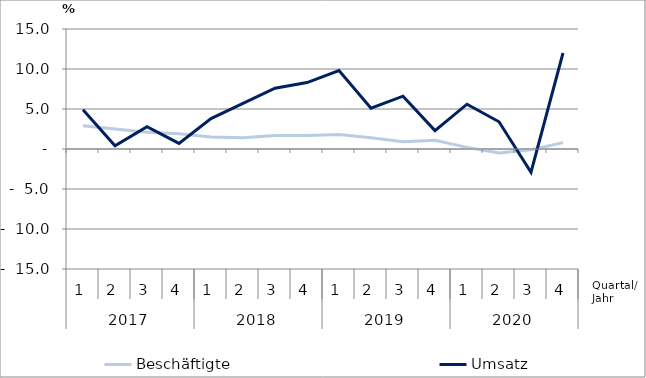
| Category | Beschäftigte | Umsatz |
|---|---|---|
| 0 | 2.9 | 4.9 |
| 1 | 2.5 | 0.4 |
| 2 | 2.1 | 2.8 |
| 3 | 1.9 | 0.7 |
| 4 | 1.5 | 3.8 |
| 5 | 1.4 | 5.7 |
| 6 | 1.7 | 7.6 |
| 7 | 1.7 | 8.3 |
| 8 | 1.8 | 9.8 |
| 9 | 1.4 | 5.1 |
| 10 | 0.9 | 6.6 |
| 11 | 1.1 | 2.3 |
| 12 | 0.2 | 5.6 |
| 13 | -0.5 | 3.4 |
| 14 | -0.1 | -2.9 |
| 15 | 0.8 | 12 |